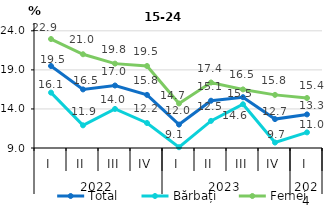
| Category | Total | Bărbați | Femei |
|---|---|---|---|
| 0 | 19.497 | 16.088 | 22.949 |
| 1 | 16.5 | 11.9 | 21 |
| 2 | 17 | 14 | 19.8 |
| 3 | 15.8 | 12.2 | 19.5 |
| 4 | 12 | 9.1 | 14.7 |
| 5 | 15.051 | 12.471 | 17.384 |
| 6 | 15.5 | 14.6 | 16.5 |
| 7 | 12.7 | 9.7 | 15.8 |
| 8 | 13.3 | 11 | 15.4 |